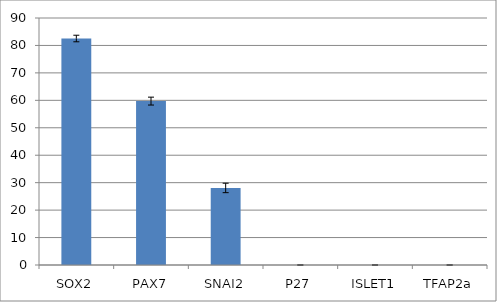
| Category | Series 0 |
|---|---|
| SOX2 | 82.526 |
| PAX7 | 59.724 |
| SNAI2 | 28.081 |
| P27 | 0 |
| ISLET1 | 0 |
| TFAP2a | 0 |